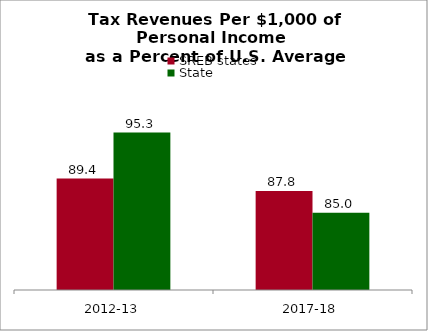
| Category | SREB states | State |
|---|---|---|
| 2012-13 | 89.368 | 95.288 |
| 2017-18 | 87.761 | 84.955 |